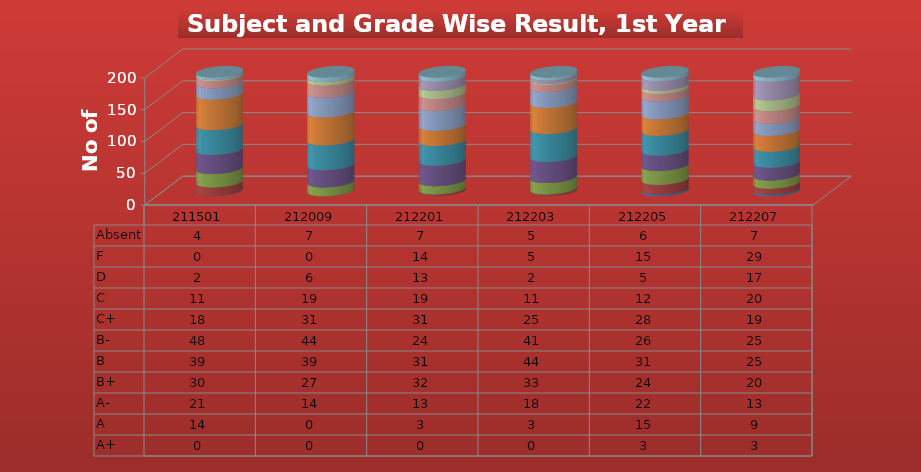
| Category | A+ | A | A- | B+ | B | B- | C+ | C | D | F | Absent |
|---|---|---|---|---|---|---|---|---|---|---|---|
| 211501.0 | 0 | 14 | 21 | 30 | 39 | 48 | 18 | 11 | 2 | 0 | 4 |
| 212009.0 | 0 | 0 | 14 | 27 | 39 | 44 | 31 | 19 | 6 | 0 | 7 |
| 212201.0 | 0 | 3 | 13 | 32 | 31 | 24 | 31 | 19 | 13 | 14 | 7 |
| 212203.0 | 0 | 3 | 18 | 33 | 44 | 41 | 25 | 11 | 2 | 5 | 5 |
| 212205.0 | 3 | 15 | 22 | 24 | 31 | 26 | 28 | 12 | 5 | 15 | 6 |
| 212207.0 | 3 | 9 | 13 | 20 | 25 | 25 | 19 | 20 | 17 | 29 | 7 |